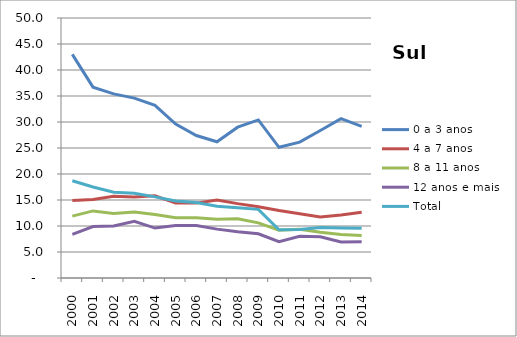
| Category | 0 a 3 anos | 4 a 7 anos | 8 a 11 anos | 12 anos e mais | Total |
|---|---|---|---|---|---|
| 2000.0 | 43 | 14.9 | 11.9 | 8.4 | 18.7 |
| 2001.0 | 36.7 | 15.1 | 12.9 | 9.9 | 17.5 |
| 2002.0 | 35.4 | 15.7 | 12.4 | 10 | 16.5 |
| 2003.0 | 34.6 | 15.6 | 12.7 | 10.9 | 16.3 |
| 2004.0 | 33.2 | 15.8 | 12.2 | 9.6 | 15.6 |
| 2005.0 | 29.6 | 14.4 | 11.6 | 10.1 | 14.8 |
| 2006.0 | 27.4 | 14.4 | 11.6 | 10.1 | 14.5 |
| 2007.0 | 26.2 | 15 | 11.3 | 9.4 | 13.8 |
| 2008.0 | 29 | 14.3 | 11.4 | 8.9 | 13.5 |
| 2009.0 | 30.4 | 13.7 | 10.6 | 8.5 | 13.2 |
| 2010.0 | 25.132 | 12.969 | 9.178 | 6.99 | 9.278 |
| 2011.0 | 26.138 | 12.371 | 9.365 | 8.026 | 9.345 |
| 2012.0 | 28.361 | 11.743 | 8.806 | 7.947 | 9.695 |
| 2013.0 | 30.633 | 12.124 | 8.352 | 6.941 | 9.61 |
| 2014.0 | 29.152 | 12.63 | 8.19 | 6.95 | 9.562 |